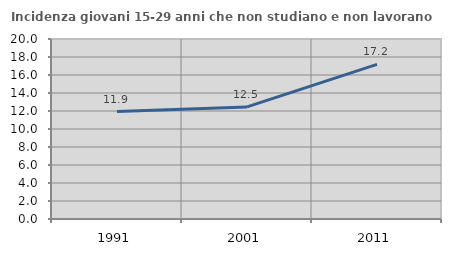
| Category | Incidenza giovani 15-29 anni che non studiano e non lavorano  |
|---|---|
| 1991.0 | 11.937 |
| 2001.0 | 12.457 |
| 2011.0 | 17.182 |